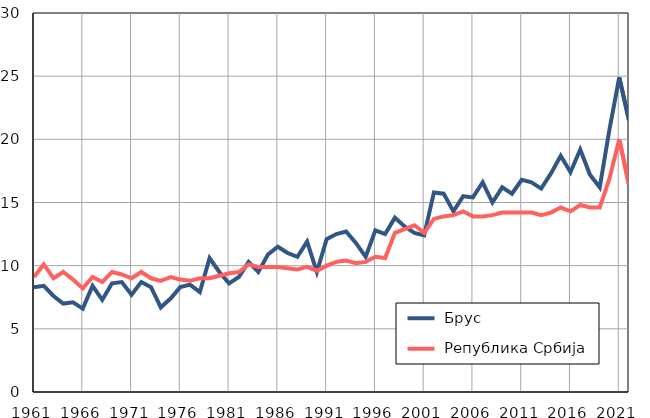
| Category |  Брус |  Република Србија |
|---|---|---|
| 1961.0 | 8.3 | 9.1 |
| 1962.0 | 8.4 | 10.1 |
| 1963.0 | 7.6 | 9 |
| 1964.0 | 7 | 9.5 |
| 1965.0 | 7.1 | 8.9 |
| 1966.0 | 6.6 | 8.2 |
| 1967.0 | 8.4 | 9.1 |
| 1968.0 | 7.3 | 8.7 |
| 1969.0 | 8.6 | 9.5 |
| 1970.0 | 8.7 | 9.3 |
| 1971.0 | 7.7 | 9 |
| 1972.0 | 8.7 | 9.5 |
| 1973.0 | 8.3 | 9 |
| 1974.0 | 6.7 | 8.8 |
| 1975.0 | 7.4 | 9.1 |
| 1976.0 | 8.3 | 8.9 |
| 1977.0 | 8.5 | 8.8 |
| 1978.0 | 7.9 | 9 |
| 1979.0 | 10.6 | 9 |
| 1980.0 | 9.5 | 9.2 |
| 1981.0 | 8.6 | 9.4 |
| 1982.0 | 9.1 | 9.5 |
| 1983.0 | 10.3 | 10.1 |
| 1984.0 | 9.5 | 9.9 |
| 1985.0 | 10.9 | 9.9 |
| 1986.0 | 11.5 | 9.9 |
| 1987.0 | 11 | 9.8 |
| 1988.0 | 10.7 | 9.7 |
| 1989.0 | 11.9 | 9.9 |
| 1990.0 | 9.5 | 9.6 |
| 1991.0 | 12.1 | 10 |
| 1992.0 | 12.5 | 10.3 |
| 1993.0 | 12.7 | 10.4 |
| 1994.0 | 11.8 | 10.2 |
| 1995.0 | 10.7 | 10.3 |
| 1996.0 | 12.8 | 10.7 |
| 1997.0 | 12.5 | 10.6 |
| 1998.0 | 13.8 | 12.6 |
| 1999.0 | 13.1 | 12.9 |
| 2000.0 | 12.6 | 13.2 |
| 2001.0 | 12.4 | 12.6 |
| 2002.0 | 15.8 | 13.7 |
| 2003.0 | 15.7 | 13.9 |
| 2004.0 | 14.3 | 14 |
| 2005.0 | 15.5 | 14.3 |
| 2006.0 | 15.4 | 13.9 |
| 2007.0 | 16.6 | 13.9 |
| 2008.0 | 15 | 14 |
| 2009.0 | 16.2 | 14.2 |
| 2010.0 | 15.7 | 14.2 |
| 2011.0 | 16.8 | 14.2 |
| 2012.0 | 16.6 | 14.2 |
| 2013.0 | 16.1 | 14 |
| 2014.0 | 17.3 | 14.2 |
| 2015.0 | 18.7 | 14.6 |
| 2016.0 | 17.4 | 14.3 |
| 2017.0 | 19.2 | 14.8 |
| 2018.0 | 17.2 | 14.6 |
| 2019.0 | 16.2 | 14.6 |
| 2020.0 | 20.8 | 16.9 |
| 2021.0 | 24.9 | 20 |
| 2022.0 | 21.5 | 16.4 |